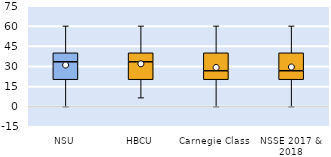
| Category | 25th | 50th | 75th |
|---|---|---|---|
| NSU | 20 | 13.333 | 6.667 |
| HBCU | 20 | 13.333 | 6.667 |
| Carnegie Class | 20 | 6.667 | 13.333 |
| NSSE 2017 & 2018 | 20 | 6.667 | 13.333 |